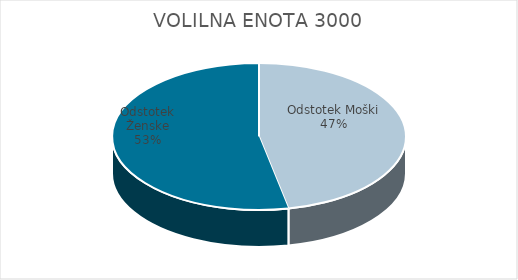
| Category | VOLILNA ENOTA 3000 | #REF! | Slovenija skupaj |
|---|---|---|---|
| Odstotek Moški | 21.92 |  | 19.85 |
| Odstotek Ženske | 24.92 |  | 21.47 |